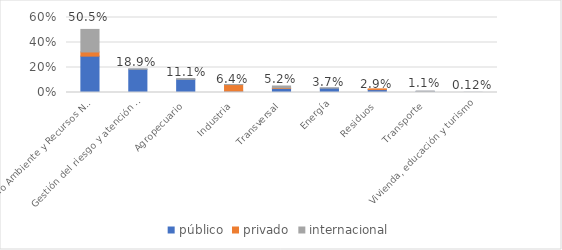
| Category | público | privado | internacional |
|---|---|---|---|
| Medio Ambiente y Recursos Naturales | 0.291 | 0.033 | 0.18 |
| Gestión del riesgo y atención de desastres | 0.186 | 0 | 0.003 |
| Agropecuario | 0.105 | 0 | 0.006 |
| Industria | 0.011 | 0.053 | 0.001 |
| Transversal | 0.032 | 0.005 | 0.015 |
| Energía | 0.034 | 0 | 0.003 |
| Residuos | 0.023 | 0.006 | 0 |
| Transporte | 0.009 | 0 | 0.003 |
| Vivienda, educación y turismo | 0 | 0 | 0.001 |